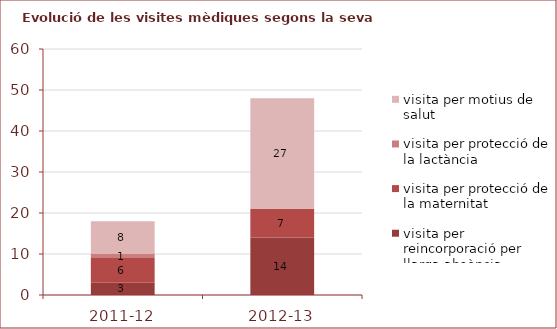
| Category | visita per reincorporació per llarga absència | visita per protecció de la maternitat | visita per protecció de la lactància | visita per motius de salut |
|---|---|---|---|---|
| 2011-12 | 3 | 6 | 1 | 8 |
| 2012-13 | 14 | 7 | 0 | 27 |